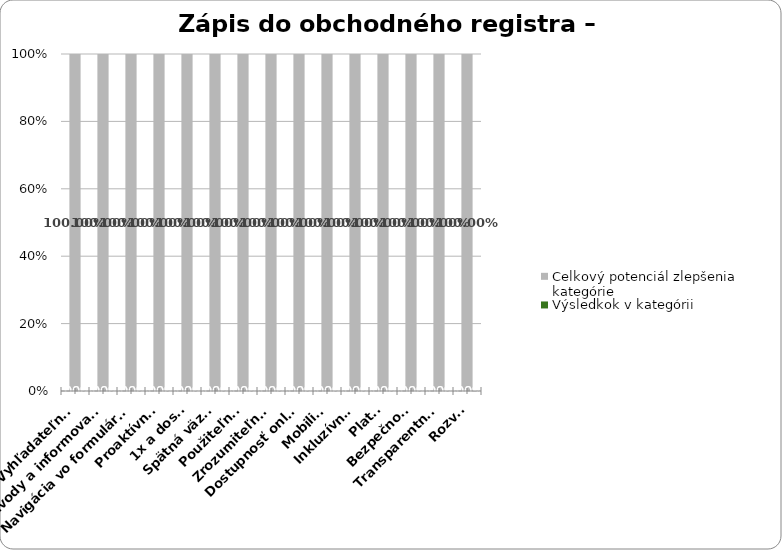
| Category | Výsledkok v kategórii | Celkový potenciál zlepšenia kategórie |
|---|---|---|
| Vyhľadateľnosť | 0 | 1 |
| Návody a informovanosť | 0 | 1 |
| Navigácia vo formulároch | 0 | 1 |
| Proaktívnosť | 0 | 1 |
| 1x a dosť! | 0 | 1 |
| Spätná väzba | 0 | 1 |
| Použiteľnosť | 0 | 1 |
| Zrozumiteľnosť | 0 | 1 |
| Dostupnosť online | 0 | 1 |
| Mobilita | 0 | 1 |
| Inkluzívnosť | 0 | 1 |
| Platba | 0 | 1 |
| Bezpečnosť | 0 | 1 |
| Transparentnosť | 0 | 1 |
| Rozvoj | 0 | 1 |